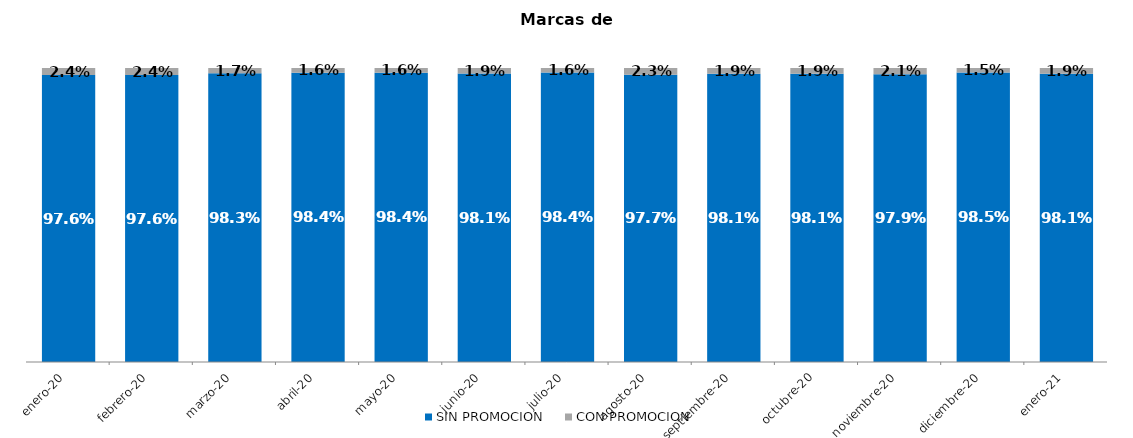
| Category | SIN PROMOCION   | CON PROMOCION   |
|---|---|---|
| 2020-01-01 | 0.976 | 0.024 |
| 2020-02-01 | 0.976 | 0.024 |
| 2020-03-01 | 0.983 | 0.017 |
| 2020-04-01 | 0.984 | 0.016 |
| 2020-05-01 | 0.984 | 0.016 |
| 2020-06-01 | 0.981 | 0.019 |
| 2020-07-01 | 0.984 | 0.016 |
| 2020-08-01 | 0.977 | 0.023 |
| 2020-09-01 | 0.981 | 0.019 |
| 2020-10-01 | 0.981 | 0.019 |
| 2020-11-01 | 0.979 | 0.021 |
| 2020-12-01 | 0.985 | 0.015 |
| 2021-01-01 | 0.981 | 0.019 |